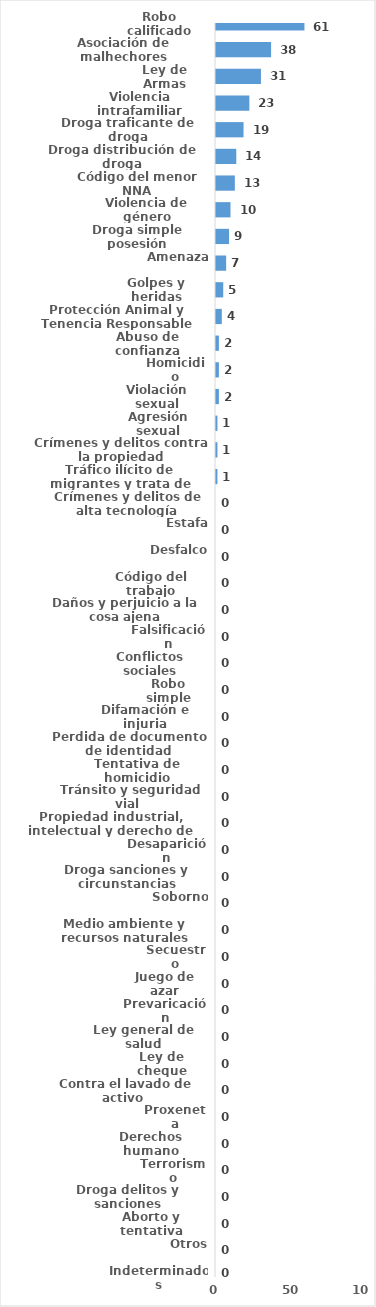
| Category | Series 0 |
|---|---|
| Robo calificado | 61 |
| Asociación de malhechores | 38 |
| Ley de Armas | 31 |
| Violencia intrafamiliar | 23 |
| Droga traficante de droga | 19 |
| Droga distribución de droga | 14 |
| Código del menor NNA | 13 |
| Violencia de género | 10 |
| Droga simple posesión | 9 |
| Amenaza | 7 |
| Golpes y heridas | 5 |
| Protección Animal y Tenencia Responsable | 4 |
| Abuso de confianza | 2 |
| Homicidio | 2 |
| Violación sexual | 2 |
| Agresión sexual | 1 |
| Crímenes y delitos contra la propiedad | 1 |
| Tráfico ilícito de migrantes y trata de personas | 1 |
| Crímenes y delitos de alta tecnología | 0 |
| Estafa | 0 |
| Desfalco | 0 |
| Código del trabajo | 0 |
| Daños y perjuicio a la cosa ajena | 0 |
| Falsificación | 0 |
| Conflictos sociales | 0 |
| Robo simple | 0 |
| Difamación e injuria | 0 |
| Perdida de documento de identidad | 0 |
| Tentativa de homicidio | 0 |
| Tránsito y seguridad vial  | 0 |
| Propiedad industrial, intelectual y derecho de autor | 0 |
| Desaparición | 0 |
| Droga sanciones y circunstancias agravantes | 0 |
| Soborno | 0 |
| Medio ambiente y recursos naturales | 0 |
| Secuestro | 0 |
| Juego de azar | 0 |
| Prevaricación | 0 |
| Ley general de salud | 0 |
| Ley de cheque | 0 |
| Contra el lavado de activo  | 0 |
| Proxeneta | 0 |
| Derechos humano | 0 |
| Terrorismo | 0 |
| Droga delitos y sanciones | 0 |
| Aborto y tentativa | 0 |
| Otros | 0 |
| Indeterminados | 0 |